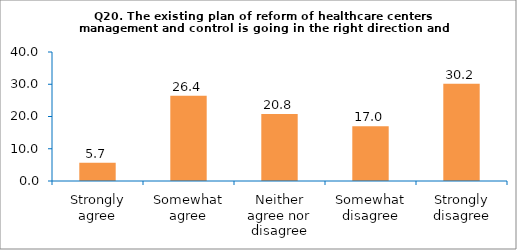
| Category | Series 0 |
|---|---|
| Strongly agree | 5.66 |
| Somewhat agree | 26.415 |
| Neither agree nor disagree | 20.755 |
| Somewhat disagree | 16.981 |
| Strongly disagree | 30.189 |